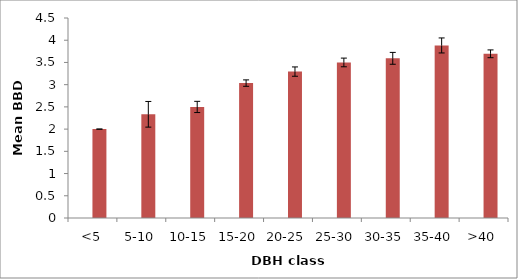
| Category | Series 0 | Series 1 |
|---|---|---|
| <5 |  | 2 |
| 5-10 |  | 2.333 |
| 10-15 |  | 2.499 |
| 15-20 |  | 3.035 |
| 20-25 |  | 3.294 |
| 25-30 |  | 3.5 |
| 30-35 |  | 3.593 |
| 35-40 |  | 3.882 |
| >40 |  | 3.694 |